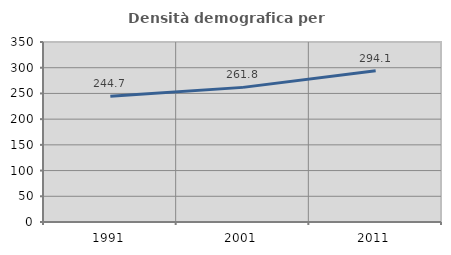
| Category | Densità demografica |
|---|---|
| 1991.0 | 244.704 |
| 2001.0 | 261.765 |
| 2011.0 | 294.13 |